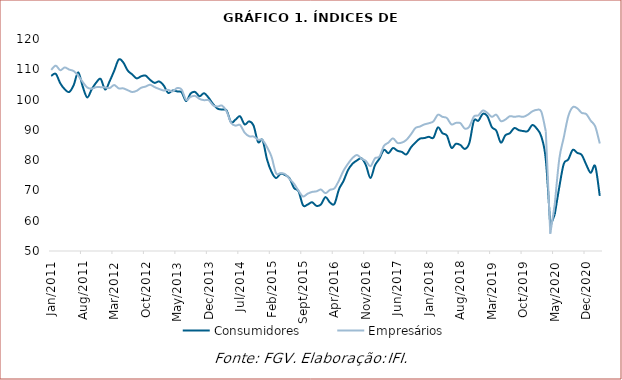
| Category | Consumidores | Empresários |
|---|---|---|
| 2011-01-01 | 107.8 | 109.8 |
| 2011-02-01 | 108.5 | 111.2 |
| 2011-03-01 | 105.4 | 109.7 |
| 2011-04-01 | 103.4 | 110.6 |
| 2011-05-01 | 102.5 | 109.9 |
| 2011-06-01 | 104.8 | 109.4 |
| 2011-07-01 | 109 | 107.9 |
| 2011-08-01 | 104.3 | 105.8 |
| 2011-09-01 | 100.7 | 104 |
| 2011-10-01 | 103.4 | 103.6 |
| 2011-11-01 | 105.6 | 104.1 |
| 2011-12-01 | 106.8 | 104.1 |
| 2012-01-01 | 103.3 | 104 |
| 2012-02-01 | 106.1 | 103.8 |
| 2012-03-01 | 109.5 | 104.8 |
| 2012-04-01 | 113.2 | 103.7 |
| 2012-05-01 | 112.3 | 103.7 |
| 2012-06-01 | 109.6 | 103.1 |
| 2012-07-01 | 108.3 | 102.5 |
| 2012-08-01 | 107 | 102.9 |
| 2012-09-01 | 107.7 | 103.9 |
| 2012-10-01 | 107.9 | 104.3 |
| 2012-11-01 | 106.5 | 104.9 |
| 2012-12-01 | 105.5 | 104.1 |
| 2013-01-01 | 106 | 103.5 |
| 2013-02-01 | 104.7 | 103 |
| 2013-03-01 | 102.2 | 103.2 |
| 2013-04-01 | 103 | 102.7 |
| 2013-05-01 | 102.7 | 103.8 |
| 2013-06-01 | 102.4 | 103.3 |
| 2013-07-01 | 99.5 | 99.9 |
| 2013-08-01 | 102 | 100.9 |
| 2013-09-01 | 102.5 | 101.2 |
| 2013-10-01 | 101.1 | 100.2 |
| 2013-11-01 | 102.1 | 99.8 |
| 2013-12-01 | 100.6 | 99.8 |
| 2014-01-01 | 98.5 | 98.1 |
| 2014-02-01 | 97 | 97.7 |
| 2014-03-01 | 96.7 | 98 |
| 2014-04-01 | 96.4 | 96.1 |
| 2014-05-01 | 92.5 | 92.3 |
| 2014-06-01 | 93.4 | 91.4 |
| 2014-07-01 | 94.5 | 91.6 |
| 2014-08-01 | 91.8 | 89.1 |
| 2014-09-01 | 92.8 | 87.9 |
| 2014-10-01 | 91.4 | 87.8 |
| 2014-11-01 | 86 | 86.8 |
| 2014-12-01 | 86.6 | 86.6 |
| 2015-01-01 | 80.2 | 84.3 |
| 2015-02-01 | 76.1 | 81.1 |
| 2015-03-01 | 74.1 | 75.7 |
| 2015-04-01 | 75.5 | 75.7 |
| 2015-05-01 | 75.1 | 75.4 |
| 2015-06-01 | 74 | 73.8 |
| 2015-07-01 | 70.8 | 72.2 |
| 2015-08-01 | 69.7 | 69.9 |
| 2015-09-01 | 65.1 | 68 |
| 2015-10-01 | 65.3 | 68.9 |
| 2015-11-01 | 66.1 | 69.5 |
| 2015-12-01 | 64.9 | 69.7 |
| 2016-01-01 | 65.4 | 70.3 |
| 2016-02-01 | 67.8 | 69.1 |
| 2016-03-01 | 66 | 70.2 |
| 2016-04-01 | 65.6 | 70.7 |
| 2016-05-01 | 70.4 | 73.3 |
| 2016-06-01 | 73.1 | 76.5 |
| 2016-07-01 | 76.7 | 78.8 |
| 2016-08-01 | 78.8 | 80.7 |
| 2016-09-01 | 79.9 | 81.7 |
| 2016-10-01 | 80.6 | 80.5 |
| 2016-11-01 | 78.3 | 79.7 |
| 2016-12-01 | 74.1 | 78 |
| 2017-01-01 | 78.3 | 80.6 |
| 2017-02-01 | 80.5 | 81.2 |
| 2017-03-01 | 83.4 | 84.7 |
| 2017-04-01 | 82.3 | 85.8 |
| 2017-05-01 | 84 | 87.2 |
| 2017-06-01 | 83.1 | 85.7 |
| 2017-07-01 | 82.7 | 85.8 |
| 2017-08-01 | 81.9 | 86.7 |
| 2017-09-01 | 84.2 | 88.5 |
| 2017-10-01 | 85.8 | 90.6 |
| 2017-11-01 | 87.1 | 91.1 |
| 2017-12-01 | 87.3 | 91.8 |
| 2018-01-01 | 87.7 | 92.2 |
| 2018-02-01 | 87.4 | 92.8 |
| 2018-03-01 | 90.8 | 95 |
| 2018-04-01 | 88.9 | 94.3 |
| 2018-05-01 | 88.1 | 93.9 |
| 2018-06-01 | 84.1 | 91.8 |
| 2018-07-01 | 85.4 | 92.3 |
| 2018-08-01 | 85 | 92.2 |
| 2018-09-01 | 83.7 | 90.4 |
| 2018-10-01 | 85.7 | 91.1 |
| 2018-11-01 | 93 | 94.4 |
| 2018-12-01 | 93 | 94.8 |
| 2019-01-01 | 95.3 | 96.4 |
| 2019-02-01 | 94.5 | 95.6 |
| 2019-03-01 | 90.9 | 94.3 |
| 2019-04-01 | 89.7 | 95 |
| 2019-05-01 | 85.8 | 92.9 |
| 2019-06-01 | 88.2 | 93.4 |
| 2019-07-01 | 88.9 | 94.5 |
| 2019-08-01 | 90.6 | 94.3 |
| 2019-09-01 | 89.9 | 94.5 |
| 2019-10-01 | 89.6 | 94.3 |
| 2019-11-01 | 89.6 | 95 |
| 2019-12-01 | 91.6 | 96.1 |
| 2020-01-01 | 90.4 | 96.6 |
| 2020-02-01 | 87.8 | 96 |
| 2020-03-01 | 80.2 | 89.5 |
| 2020-04-01 | 58.2 | 55.7 |
| 2020-05-01 | 62.1 | 65.5 |
| 2020-06-01 | 71.1 | 80.4 |
| 2020-07-01 | 78.8 | 87.5 |
| 2020-08-01 | 80.2 | 94.5 |
| 2020-09-01 | 83.4 | 97.5 |
| 2020-10-01 | 82.4 | 97.1 |
| 2020-11-01 | 81.7 | 95.6 |
| 2020-12-01 | 78.5 | 95.2 |
| 2021-01-01 | 75.8 | 93 |
| 2021-02-01 | 78 | 91.1 |
| 2021-03-01 | 68.2 | 85.5 |